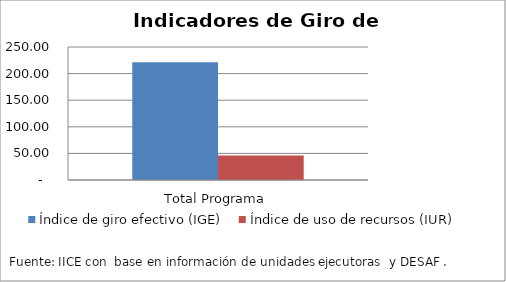
| Category | Índice de giro efectivo (IGE) | Índice de uso de recursos (IUR)  |
|---|---|---|
| Total Programa | 221.249 | 46.002 |